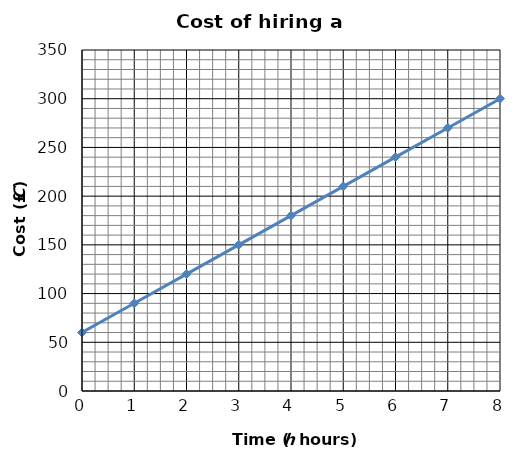
| Category | C |
|---|---|
| 0.0 | 60 |
| 1.0 | 90 |
| 2.0 | 120 |
| 3.0 | 150 |
| 4.0 | 180 |
| 5.0 | 210 |
| 6.0 | 240 |
| 7.0 | 270 |
| 8.0 | 300 |